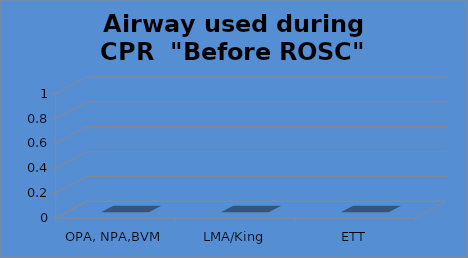
| Category | Airway used during CPR  "Before ROSC" |
|---|---|
| OPA, NPA,BVM | 0 |
| LMA/King | 0 |
| ETT | 0 |